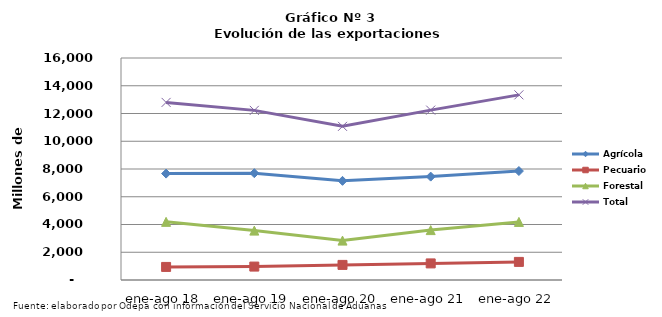
| Category | Agrícola | Pecuario | Forestal | Total |
|---|---|---|---|---|
| ene-ago 18 | 7667876 | 941525 | 4190498 | 12799899 |
| ene-ago 19 | 7699297 | 967282 | 3559468 | 12226047 |
| ene-ago 20 | 7146395 | 1088254 | 2839509 | 11074158 |
| ene-ago 21 | 7451390 | 1195756 | 3596690 | 12243836 |
| ene-ago 22 | 7852874 | 1304618 | 4186362 | 13343854 |